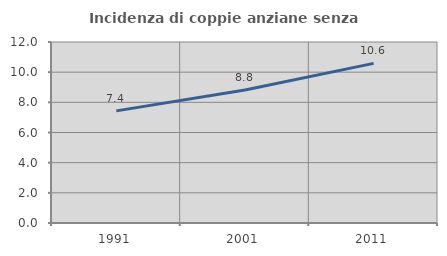
| Category | Incidenza di coppie anziane senza figli  |
|---|---|
| 1991.0 | 7.435 |
| 2001.0 | 8.815 |
| 2011.0 | 10.583 |